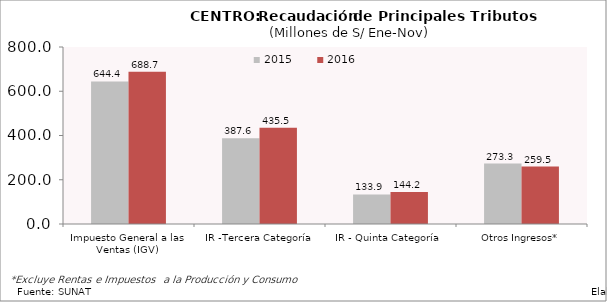
| Category | 2015 | 2016 |
|---|---|---|
| Impuesto General a las Ventas (IGV) | 644.366 | 688.652 |
| IR -Tercera Categoría | 387.626 | 435.497 |
| IR - Quinta Categoría | 133.895 | 144.181 |
| Otros Ingresos* | 273.306 | 259.54 |